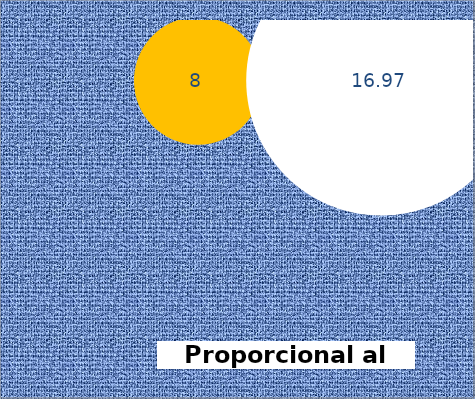
| Category | Series 0 |
|---|---|
| 1.0 | 1 |
| 2.0 | 1 |